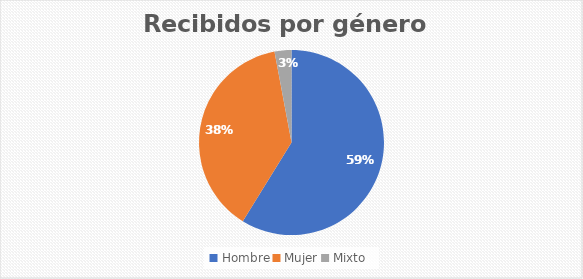
| Category | Recibidos por género  Cantidad |
|---|---|
| Hombre | 20 |
| Mujer | 13 |
| Mixto | 1 |